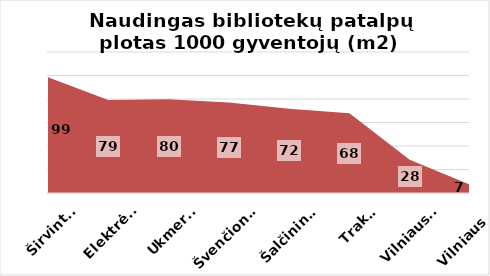
| Category | Series 0 |
|---|---|
| Širvintos | 98.587 |
| Elektrėnai | 79.16 |
| Ukmergė | 79.707 |
| Švenčionys | 76.923 |
| Šalčininkai | 71.614 |
| Trakai | 67.801 |
| Vilniaus r. | 28.361 |
| Vilniaus m. | 7.096 |